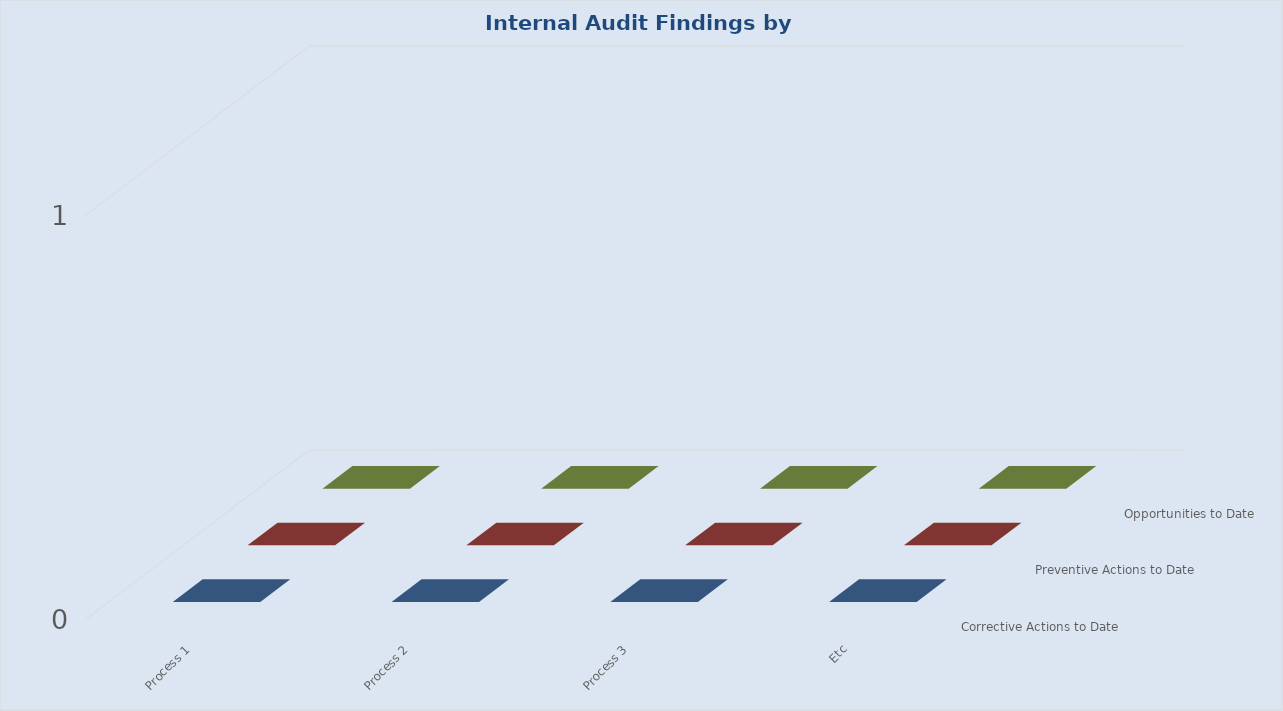
| Category | Corrective Actions to Date | Preventive Actions to Date | Opportunities to Date |
|---|---|---|---|
| Process 1 | 0 | 0 | 0 |
| Process 2 | 0 | 0 | 0 |
| Process 3 | 0 | 0 | 0 |
| Etc | 0 | 0 | 0 |